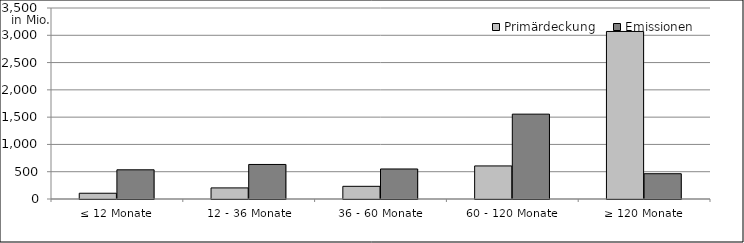
| Category | Primärdeckung | Emissionen |
|---|---|---|
| ≤ 12 Monate | 105415666.76 | 535000000 |
| 12 - 36 Monate | 203355804.751 | 632932113.52 |
| 36 - 60 Monate | 232419787.131 | 550150000 |
| 60 - 120 Monate | 606009903.66 | 1555000000 |
| ≥ 120 Monate | 3070167928.637 | 463435034.29 |